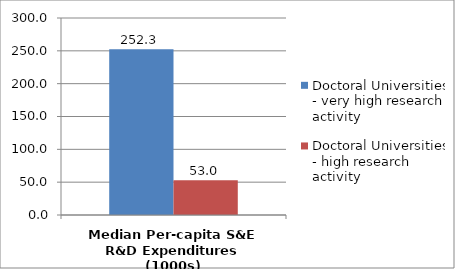
| Category | Doctoral Universities - very high research activity | Doctoral Universities - high research activity |
|---|---|---|
| Median Per-capita S&E R&D Expenditures (1000s) | 252.347 | 53.029 |